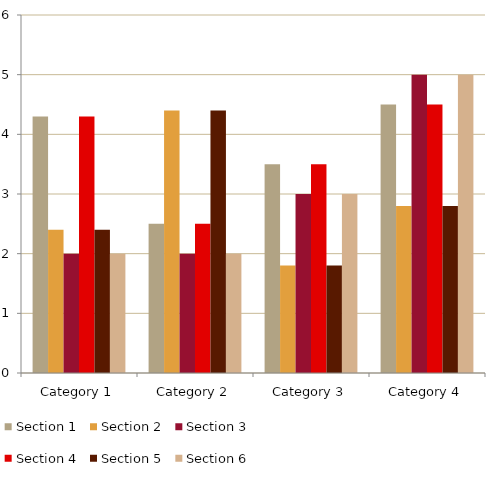
| Category | Section 1 | Section 2 | Section 3 | Section 4 | Section 5 | Section 6 |
|---|---|---|---|---|---|---|
| Category 1 | 4.3 | 2.4 | 2 | 4.3 | 2.4 | 2 |
| Category 2 | 2.5 | 4.4 | 2 | 2.5 | 4.4 | 2 |
| Category 3 | 3.5 | 1.8 | 3 | 3.5 | 1.8 | 3 |
| Category 4 | 4.5 | 2.8 | 5 | 4.5 | 2.8 | 5 |